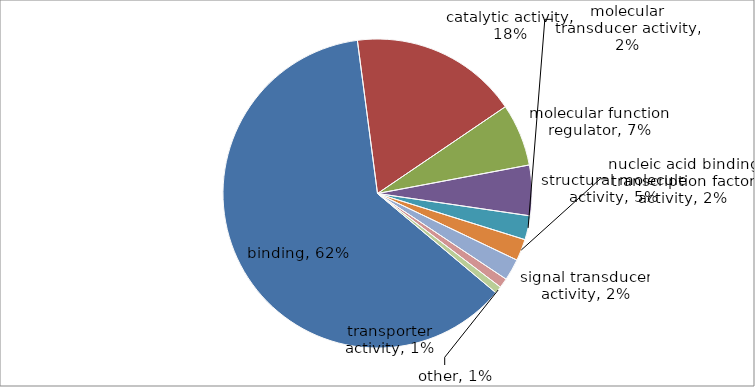
| Category | Series 0 |
|---|---|
| binding | 246 |
| catalytic activity | 70 |
| molecular function regulator | 26 |
| structural molecule activity | 21 |
| molecular transducer activity | 10 |
| nucleic acid binding transcription factor activity | 9 |
| signal transducer activity | 9 |
| transporter activity | 4 |
| other | 3 |